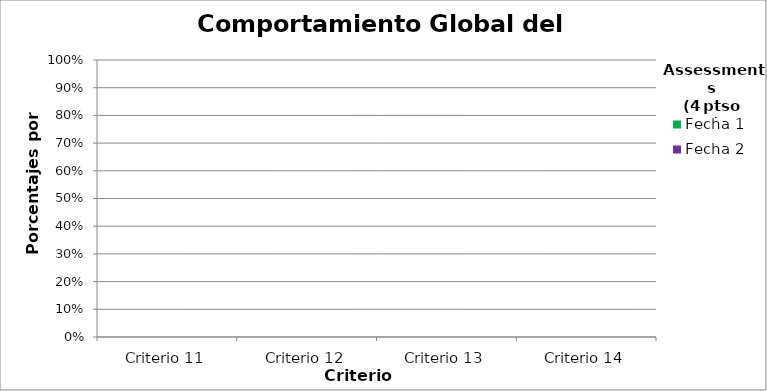
| Category | Fecha 1 | Fecha 2 |
|---|---|---|
| Criterio 11 | 0 | 0 |
| Criterio 12 | 0 | 0 |
| Criterio 13 | 0 | 0 |
| Criterio 14 | 0 | 0 |